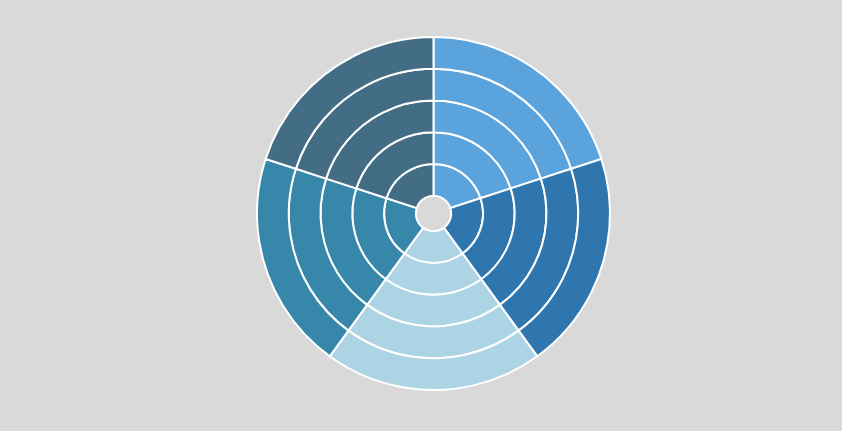
| Category | Series 0 | Series 1 | Series 2 | Series 3 | Series 4 |
|---|---|---|---|---|---|
| R True | 1 | 1 | 1 | 1 | 1 |
| R False | 0 | 0 | 0 | 0 | 0 |
| P True | 1 | 1 | 1 | 1 | 1 |
| P False | 0 | 0 | 0 | 0 | 0 |
| A True | 1 | 1 | 1 | 1 | 1 |
| A False | 0 | 0 | 0 | 0 | 0 |
| F True | 1 | 1 | 1 | 1 | 1 |
| F False | 0 | 0 | 0 | 0 | 0 |
| I True | 1 | 1 | 1 | 1 | 1 |
| I False | 0 | 0 | 0 | 0 | 0 |